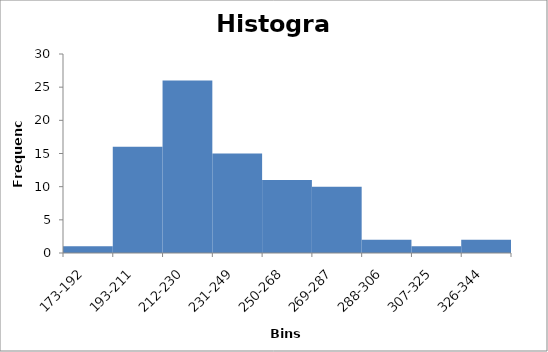
| Category | Frequency |
|---|---|
| 173-192 | 1 |
| 193-211 | 16 |
| 212-230 | 26 |
| 231-249 | 15 |
| 250-268 | 11 |
| 269-287 | 10 |
| 288-306 | 2 |
| 307-325 | 1 |
| 326-344 | 2 |